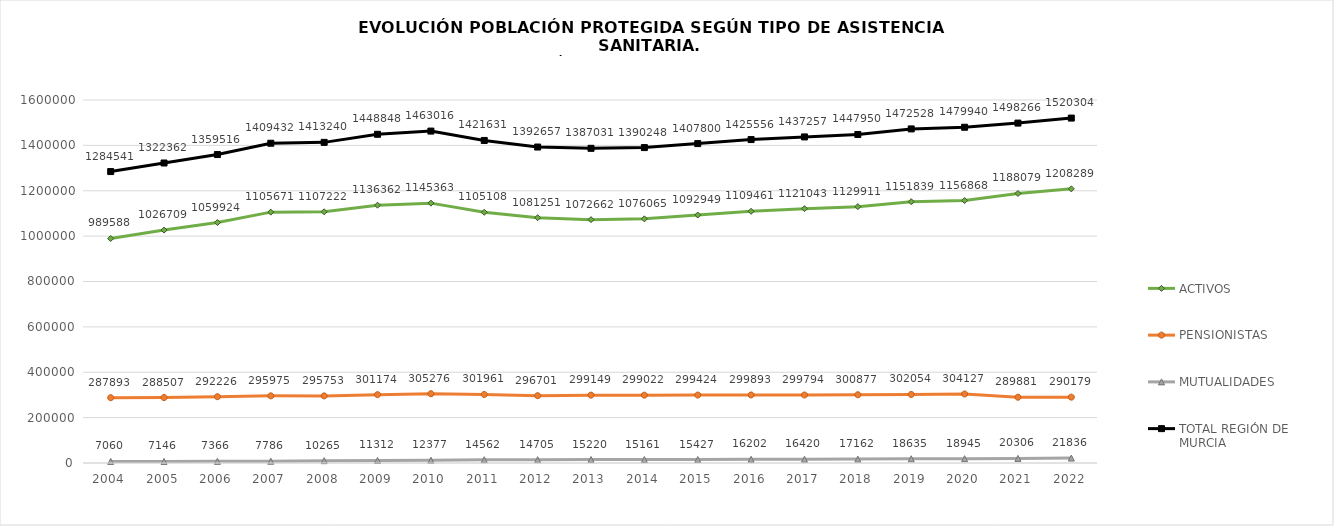
| Category | ACTIVOS | PENSIONISTAS | MUTUALIDADES | TOTAL REGIÓN DE MURCIA |
|---|---|---|---|---|
| 2004.0 | 989588 | 287893 | 7060 | 1284541 |
| 2005.0 | 1026709 | 288507 | 7146 | 1322362 |
| 2006.0 | 1059924 | 292226 | 7366 | 1359516 |
| 2007.0 | 1105671 | 295975 | 7786 | 1409432 |
| 2008.0 | 1107222 | 295753 | 10265 | 1413240 |
| 2009.0 | 1136362 | 301174 | 11312 | 1448848 |
| 2010.0 | 1145363 | 305276 | 12377 | 1463016 |
| 2011.0 | 1105108 | 301961 | 14562 | 1421631 |
| 2012.0 | 1081251 | 296701 | 14705 | 1392657 |
| 2013.0 | 1072662 | 299149 | 15220 | 1387031 |
| 2014.0 | 1076065 | 299022 | 15161 | 1390248 |
| 2015.0 | 1092949 | 299424 | 15427 | 1407800 |
| 2016.0 | 1109461 | 299893 | 16202 | 1425556 |
| 2017.0 | 1121043 | 299794 | 16420 | 1437257 |
| 2018.0 | 1129911 | 300877 | 17162 | 1447950 |
| 2019.0 | 1151839 | 302054 | 18635 | 1472528 |
| 2020.0 | 1156868 | 304127 | 18945 | 1479940 |
| 2021.0 | 1188079 | 289881 | 20306 | 1498266 |
| 2022.0 | 1208289 | 290179 | 21836 | 1520304 |